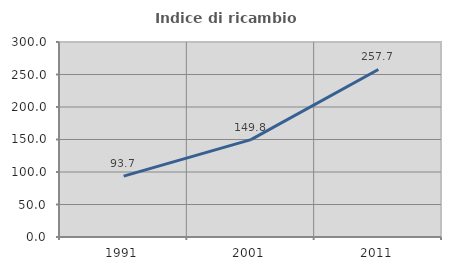
| Category | Indice di ricambio occupazionale  |
|---|---|
| 1991.0 | 93.716 |
| 2001.0 | 149.827 |
| 2011.0 | 257.709 |